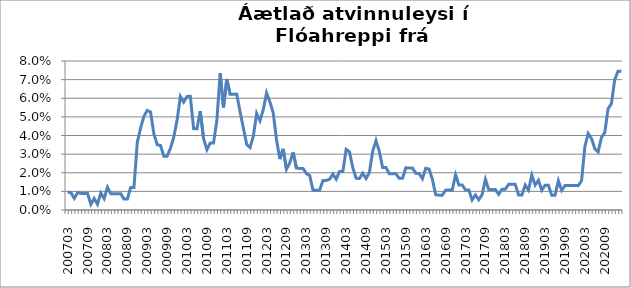
| Category | Series 0 |
|---|---|
| 200703 | 0.01 |
| 200704 | 0.009 |
| 200705 | 0.006 |
| 200706 | 0.009 |
| 200707 | 0.009 |
| 200708 | 0.009 |
| 200709 | 0.009 |
| 200710 | 0.003 |
| 200711 | 0.006 |
| 200712 | 0.003 |
| 200801 | 0.009 |
| 200802 | 0.006 |
| 200803 | 0.012 |
| 200804 | 0.009 |
| 200805 | 0.009 |
| 200806 | 0.009 |
| 200807 | 0.009 |
| 200808 | 0.006 |
| 200809 | 0.006 |
| 200810 | 0.012 |
| 200811 | 0.012 |
| 200812 | 0.036 |
| 200901 | 0.044 |
| 200902 | 0.05 |
| 200903 | 0.053 |
| 200904 | 0.053 |
| 200905 | 0.041 |
| 200906 | 0.035 |
| 200907 | 0.035 |
| 200908 | 0.029 |
| 200909 | 0.029 |
| 200910 | 0.033 |
| 200911 | 0.039 |
| 200912 | 0.048 |
| 201001 | 0.061 |
| 201002 | 0.058 |
| 201003 | 0.061 |
| 201004 | 0.061 |
| 201005 | 0.044 |
| 201006 | 0.044 |
| 201007 | 0.053 |
| 201008 | 0.038 |
| 201009 | 0.032 |
| 201010 | 0.036 |
| 201011 | 0.036 |
| 201012 | 0.048 |
| 201101 | 0.073 |
| 201102 | 0.055 |
| 201103 | 0.07 |
| 201104 | 0.062 |
| 201105 | 0.062 |
| 201106 | 0.062 |
| 201107 | 0.053 |
| 201108 | 0.044 |
| 201109 | 0.035 |
| 201110 | 0.034 |
| 201111 | 0.04 |
| 201112 | 0.052 |
| 201201 | 0.048 |
| 201202 | 0.054 |
| 201203 | 0.063 |
| 201204 | 0.058 |
| 201205 | 0.052 |
| 201206 | 0.038 |
| 201207 | 0.027 |
| 201208 | 0.033 |
| 201209 | 0.022 |
| 201210 | 0.025 |
| 201211 | 0.031 |
| 201212 | 0.023 |
| 201301 | 0.022 |
| 201302 | 0.022 |
| 201303 | 0.02 |
| 201304 | 0.019 |
| 201305 | 0.011 |
| 201306 | 0.011 |
| 201307 | 0.011 |
| 201308 | 0.016 |
| 201309 | 0.016 |
| 201310 | 0.017 |
| 201311 | 0.019 |
| 201312 | 0.017 |
| 201401 | 0.021 |
| 201402 | 0.021 |
| 201403 | 0.033 |
| 201404 | 0.031 |
| 201405 | 0.023 |
| 201406 | 0.017 |
| 201407 | 0.017 |
| 201408 | 0.02 |
| 201409 | 0.017 |
| 201410 | 0.02 |
| 201411 | 0.032 |
| 201412 | 0.037 |
| 201501 | 0.031 |
| 201502 | 0.023 |
| 201503 | 0.023 |
| 201504 | 0.019 |
| 201505 | 0.019 |
| 201506 | 0.019 |
| 201507 | 0.017 |
| 201508 | 0.017 |
| 201509 | 0.023 |
| 201510 | 0.023 |
| 201511 | 0.023 |
| 201512 | 0.02 |
| 201601 | 0.02 |
| 201602 | 0.017 |
| 201603 | 0.022 |
| 201604 | 0.022 |
| 201605 | 0.016 |
| 201606 | 0.008 |
| 201607 | 0.008 |
| 201608 | 0.008 |
| 201609 | 0.011 |
| 201610 | 0.011 |
| 201611 | 0.011 |
| 201612 | 0.019 |
| 201701 | 0.013 |
| 201702 | 0.013 |
| 201703 | 0.011 |
| 201704 | 0.011 |
| 201705 | 0.005 |
| 201706 | 0.008 |
| 201707 | 0.005 |
| 201708 | 0.008 |
| 201709 | 0.016 |
| 201710 | 0.011 |
| 201711 | 0.011 |
| 201712 | 0.011 |
| 201801 | 0.008 |
| 201802 | 0.011 |
| 201803 | 0.011 |
| 201804 | 0.014 |
| 201805 | 0.014 |
| 201806 | 0.014 |
| 201807 | 0.008 |
| 201808 | 0.008 |
| 201809 | 0.013 |
| 201810 | 0.011 |
| 201811 | 0.019 |
| 201812 | 0.013 |
| 201901 | 0.016 |
| 201902 | 0.011 |
| 201903 | 0.013 |
| 201904 | 0.013 |
| 201905 | 0.008 |
| 201906 | 0.008 |
| 201907 | 0.016 |
| 201908 | 0.01 |
| 201909 | 0.013 |
| 201910 | 0.013 |
| 201911 | 0.013 |
| 201912 | 0.013 |
| 202001 | 0.013 |
| 202002 | 0.016 |
| 202003 | 0.034 |
| 202004 | 0.041 |
| 202005 | 0.038 |
| 202006 | 0.033 |
| 202007 | 0.031 |
| 202008 | 0.039 |
| 202009 | 0.042 |
| 202010 | 0.054 |
| 202011 | 0.057 |
| 202012 | 0.07 |
| 202101 | 0.075 |
| 202102 | 0.075 |